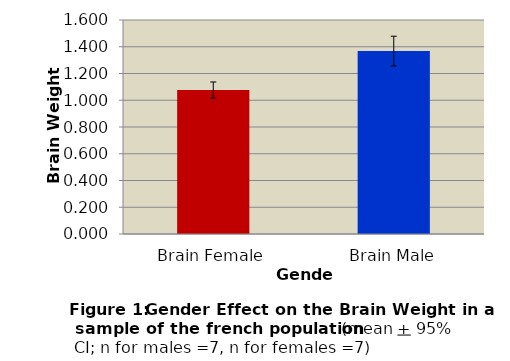
| Category | French |
|---|---|
| Brain Female | 1.076 |
| Brain Male | 1.368 |